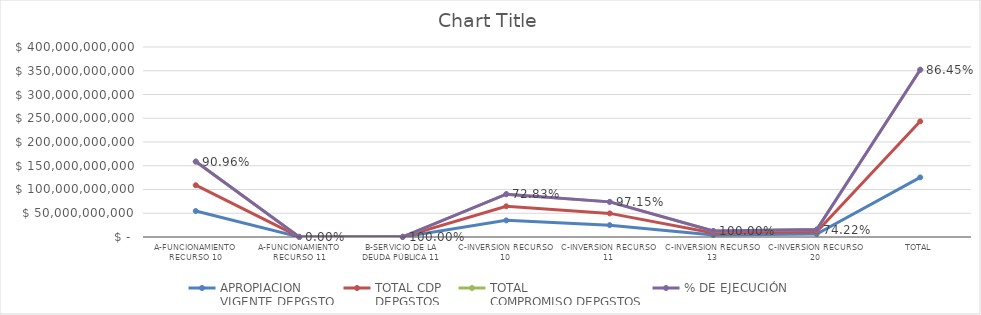
| Category | APROPIACION
VIGENTE DEPGSTO | TOTAL CDP
DEPGSTOS | TOTAL
COMPROMISO DEPGSTOS | % DE EJECUCIÓN |
|---|---|---|---|---|
| A-FUNCIONAMIENTO RECURSO 10 | 54704000000 | 54327694169.2 | 49759657681.29 | 0.91 |
| A-FUNCIONAMIENTO RECURSO 11 | 231000000 | 0 | 0 | 0 |
| B-SERVICIO DE LA DEUDA PÚBLICA 11 | 131748779 | 131748779 | 131748778.8 | 1 |
| C-INVERSION RECURSO 10 | 35000000000 | 29696645506.8 | 25490894404.87 | 0.728 |
| C-INVERSION RECURSO 11 | 24983074635 | 24702054971.21 | 24271248000.93 | 0.972 |
| C-INVERSION RECURSO 13 | 4242000000 | 4242000000 | 4242000000 | 1 |
| C-INVERSION RECURSO 20 | 6251000000 | 4881151794.42 | 4639478752.42 | 0.742 |
| TOTAL | 125542823414 | 117981295220.63 | 108535027618.31 | 0.865 |